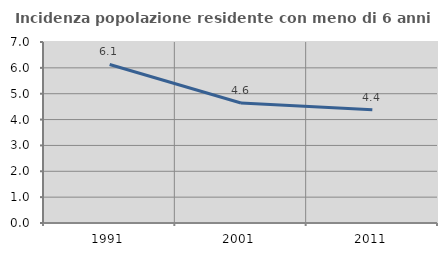
| Category | Incidenza popolazione residente con meno di 6 anni |
|---|---|
| 1991.0 | 6.131 |
| 2001.0 | 4.64 |
| 2011.0 | 4.379 |